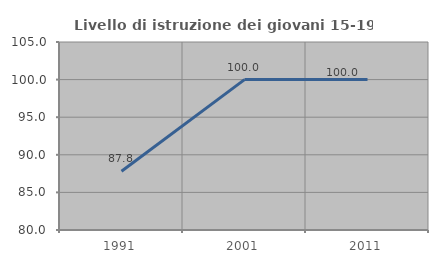
| Category | Livello di istruzione dei giovani 15-19 anni |
|---|---|
| 1991.0 | 87.805 |
| 2001.0 | 100 |
| 2011.0 | 100 |